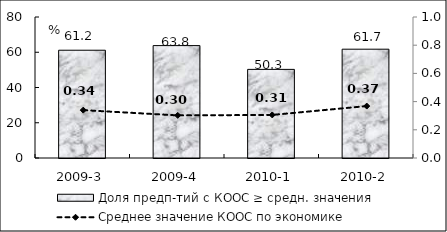
| Category | Доля предп-тий с КООС ≥ средн. значения  |
|---|---|
| 2009-3 | 61.15 |
| 2009-4 | 63.77 |
| 2010-1 | 50.28 |
| 2010-2 | 61.73 |